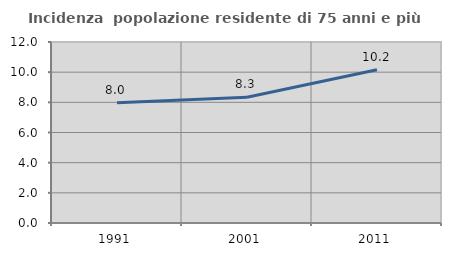
| Category | Incidenza  popolazione residente di 75 anni e più |
|---|---|
| 1991.0 | 7.965 |
| 2001.0 | 8.342 |
| 2011.0 | 10.162 |